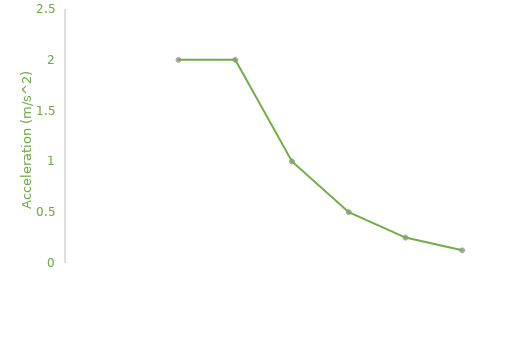
| Category | Acceleration (m/s^2) |
|---|---|
| 0.0 | 2 |
| 1.0 | 2 |
| 2.0 | 1 |
| 3.0 | 0.5 |
| 4.0 | 0.25 |
| 5.0 | 0.125 |